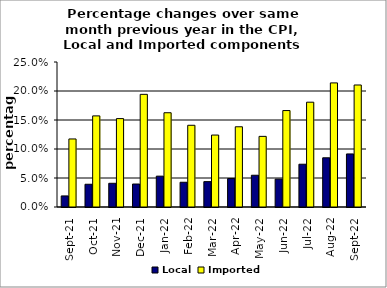
| Category | Local | Imported |
|---|---|---|
| 2021-09-01 | 0.019 | 0.117 |
| 2021-10-01 | 0.039 | 0.157 |
| 2021-11-01 | 0.041 | 0.152 |
| 2021-12-01 | 0.04 | 0.194 |
| 2022-01-01 | 0.053 | 0.163 |
| 2022-02-01 | 0.043 | 0.141 |
| 2022-03-01 | 0.044 | 0.124 |
| 2022-04-01 | 0.049 | 0.138 |
| 2022-05-01 | 0.055 | 0.122 |
| 2022-06-01 | 0.048 | 0.166 |
| 2022-07-01 | 0.074 | 0.181 |
| 2022-08-01 | 0.085 | 0.214 |
| 2022-09-01 | 0.091 | 0.21 |